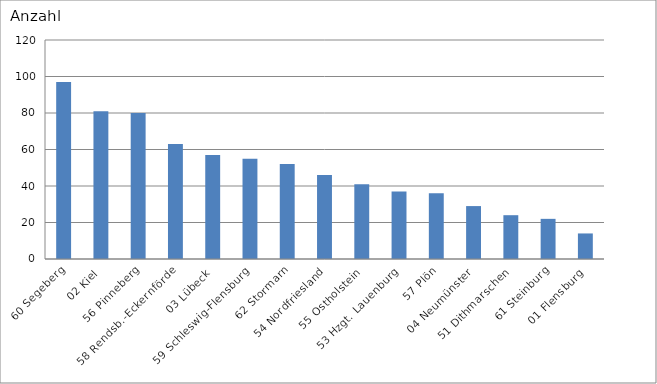
| Category | 60 Segeberg 02 Kiel 56 Pinneberg 58 Rendsb.-Eckernförde 03 Lübeck 59 Schleswig-Flensburg 62 Stormarn 54 Nordfriesland 55 Ostholstein 53 Hzgt. Lauenburg 57 Plön 04 Neumünster 51 Dithmarschen 61 Steinburg 01 Flensburg |
|---|---|
| 60 Segeberg | 97 |
| 02 Kiel | 81 |
| 56 Pinneberg | 80 |
| 58 Rendsb.-Eckernförde | 63 |
| 03 Lübeck | 57 |
| 59 Schleswig-Flensburg | 55 |
| 62 Stormarn | 52 |
| 54 Nordfriesland | 46 |
| 55 Ostholstein | 41 |
| 53 Hzgt. Lauenburg | 37 |
| 57 Plön | 36 |
| 04 Neumünster | 29 |
| 51 Dithmarschen | 24 |
| 61 Steinburg | 22 |
| 01 Flensburg | 14 |